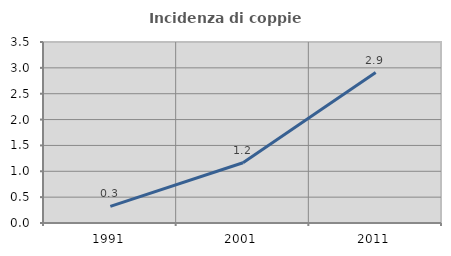
| Category | Incidenza di coppie miste |
|---|---|
| 1991.0 | 0.32 |
| 2001.0 | 1.165 |
| 2011.0 | 2.909 |